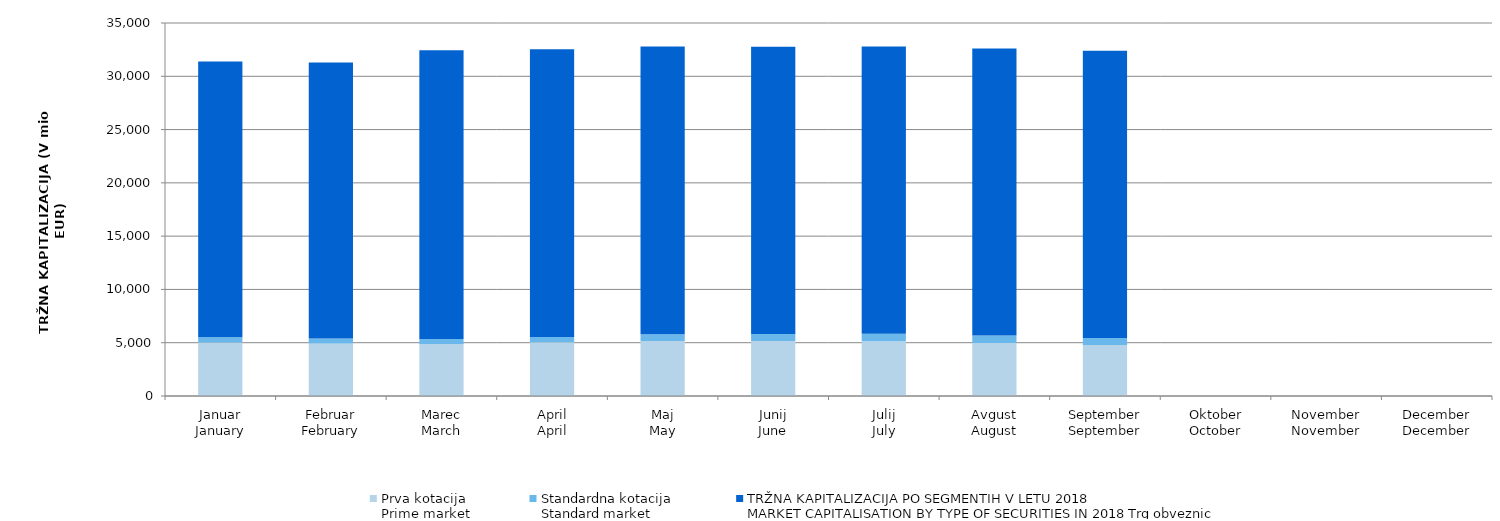
| Category | Prva kotacija
Prime market | Standardna kotacija
Standard market | Series 3 |
|---|---|---|---|
| Januar
January | 5022.792 | 483.67 | 25885.901 |
| Februar
February | 4922.405 | 471.165 | 25899.375 |
| Marec
March | 4884.025 | 463.212 | 27099.633 |
| April
April | 5038.448 | 492.653 | 27015.924 |
| Maj
May | 5153.368 | 630.304 | 27015.655 |
| Junij
June | 5151.963 | 663.065 | 26962.481 |
| Julij
July | 5126.931 | 703.136 | 26961.579 |
| Avgust
August | 4963.893 | 702.004 | 26952.115 |
| September
September | 4788.635 | 655.294 | 26952.079 |
| Oktober
October | 0 | 0 | 0 |
| November
November | 0 | 0 | 0 |
| December
December | 0 | 0 | 0 |